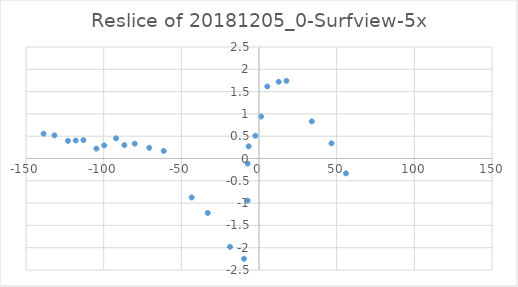
| Category | Reslice of 20181205_0-Surfview-5x |
|---|---|
| -9.666666666666666 | -2.249 |
| -18.666666666666668 | -1.98 |
| -33.0 | -1.221 |
| -7.333333333333333 | -0.943 |
| -43.333333333333336 | -0.874 |
| 56.0 | -0.333 |
| -7.333333333333333 | -0.113 |
| -61.333333333333336 | 0.17 |
| -104.66666666666667 | 0.222 |
| -70.66666666666667 | 0.24 |
| -6.666666666666667 | 0.272 |
| -99.66666666666667 | 0.294 |
| -86.66666666666667 | 0.3 |
| -80.0 | 0.333 |
| 46.666666666666664 | 0.339 |
| -123.0 | 0.396 |
| -118.0 | 0.404 |
| -113.0 | 0.412 |
| -92.0 | 0.452 |
| -2.3333333333333335 | 0.509 |
| -131.66666666666666 | 0.519 |
| -138.66666666666666 | 0.555 |
| 34.0 | 0.832 |
| 1.3333333333333333 | 0.941 |
| 5.333333333333333 | 1.615 |
| 12.666666666666666 | 1.72 |
| 17.666666666666668 | 1.741 |